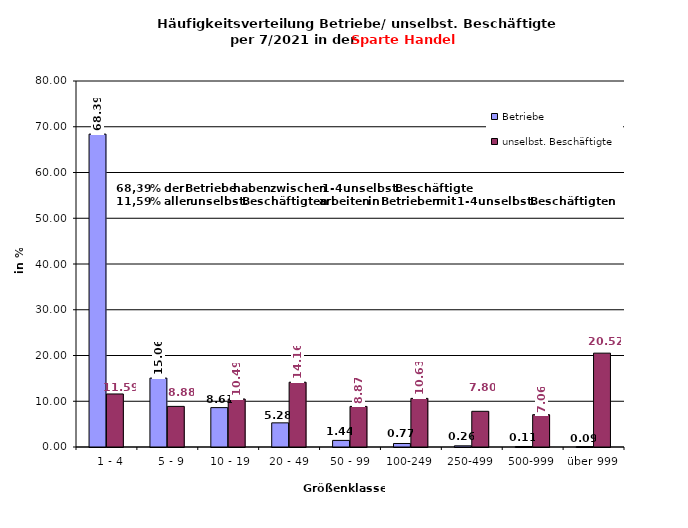
| Category | Betriebe | unselbst. Beschäftigte |
|---|---|---|
|   1 - 4 | 68.39 | 11.594 |
|   5 - 9 | 15.06 | 8.877 |
|  10 - 19 | 8.608 | 10.492 |
| 20 - 49 | 5.278 | 14.159 |
| 50 - 99 | 1.441 | 8.871 |
| 100-249 | 0.765 | 10.625 |
| 250-499 | 0.258 | 7.801 |
| 500-999 | 0.109 | 7.064 |
| über 999 | 0.089 | 20.515 |